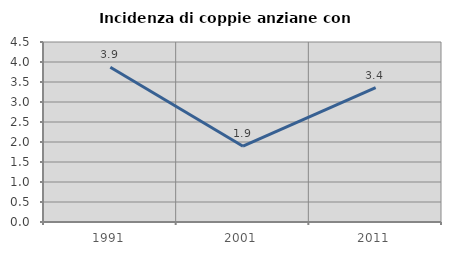
| Category | Incidenza di coppie anziane con figli |
|---|---|
| 1991.0 | 3.867 |
| 2001.0 | 1.896 |
| 2011.0 | 3.36 |